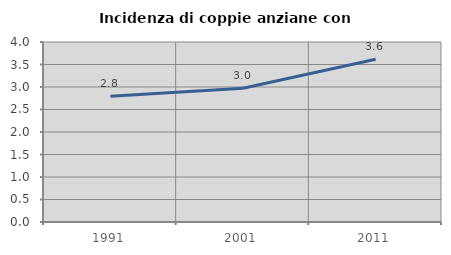
| Category | Incidenza di coppie anziane con figli |
|---|---|
| 1991.0 | 2.797 |
| 2001.0 | 2.973 |
| 2011.0 | 3.616 |